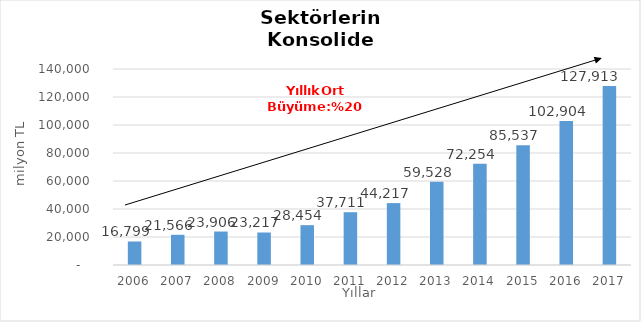
| Category | Toplam |
|---|---|
| 2006.0 | 16799.249 |
| 2007.0 | 21566.057 |
| 2008.0 | 23906.328 |
| 2009.0 | 23216.54 |
| 2010.0 | 28454.489 |
| 2011.0 | 37710.665 |
| 2012.0 | 44216.529 |
| 2013.0 | 59528.288 |
| 2014.0 | 72253.719 |
| 2015.0 | 85537 |
| 2016.0 | 102904 |
| 2017.0 | 127913 |